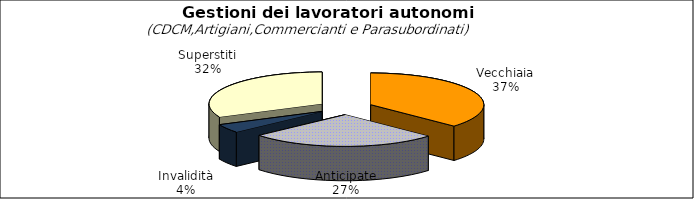
| Category | Series 0 |
|---|---|
| Vecchiaia | 64790 |
| Anticipate | 47327 |
| Invalidità | 7779 |
| Superstiti | 56069 |